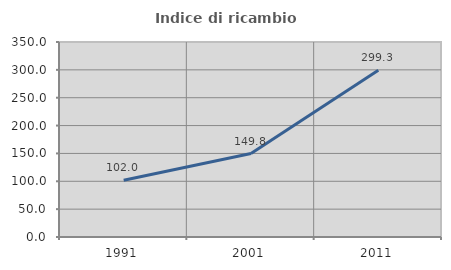
| Category | Indice di ricambio occupazionale  |
|---|---|
| 1991.0 | 101.994 |
| 2001.0 | 149.828 |
| 2011.0 | 299.321 |